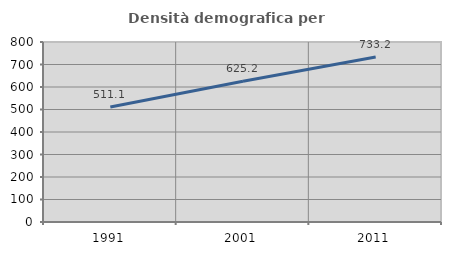
| Category | Densità demografica |
|---|---|
| 1991.0 | 511.086 |
| 2001.0 | 625.237 |
| 2011.0 | 733.181 |